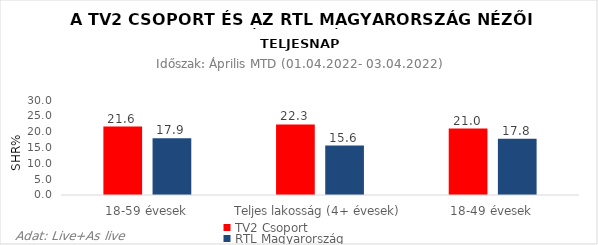
| Category | TV2 Csoport | RTL Magyarország |
|---|---|---|
| 18-59 évesek | 21.6 | 17.9 |
| Teljes lakosság (4+ évesek) | 22.3 | 15.6 |
| 18-49 évesek | 21 | 17.8 |